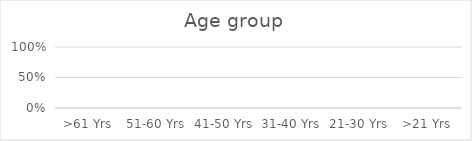
| Category | Series 0 |
|---|---|
| >61 Yrs | 0 |
| 51-60 Yrs | 0 |
| 41-50 Yrs | 0 |
| 31-40 Yrs | 0 |
| 21-30 Yrs | 0 |
| >21 Yrs | 0 |